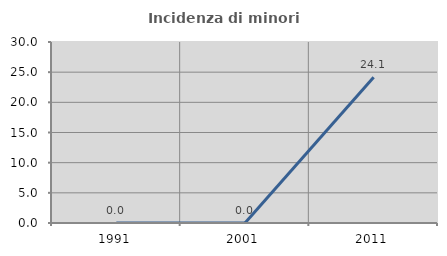
| Category | Incidenza di minori stranieri |
|---|---|
| 1991.0 | 0 |
| 2001.0 | 0 |
| 2011.0 | 24.138 |